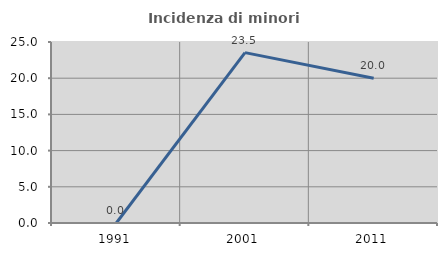
| Category | Incidenza di minori stranieri |
|---|---|
| 1991.0 | 0 |
| 2001.0 | 23.529 |
| 2011.0 | 20 |